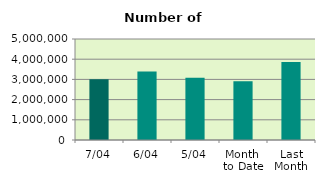
| Category | Series 0 |
|---|---|
| 7/04 | 3009772 |
| 6/04 | 3392798 |
| 5/04 | 3084358 |
| Month 
to Date | 2913624.4 |
| Last
Month | 3862771.739 |